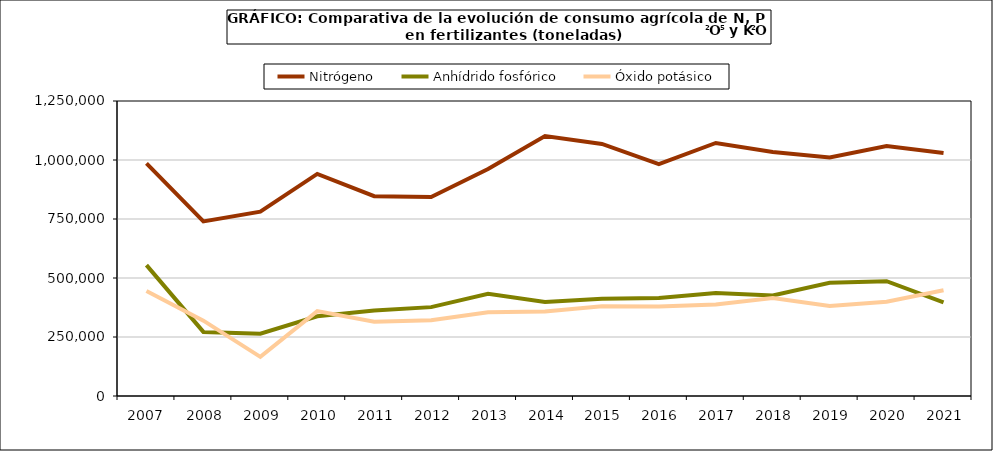
| Category | Nitrógeno | Anhídrido fosfórico | Óxido potásico |
|---|---|---|---|
|   2007  | 985857 | 554382 | 444853 |
|   2008 | 739757 | 271578 | 319194 |
|   2009 | 781069 | 264211 | 166016 |
|   2010 | 940984 | 337812 | 359583 |
|   2011 | 846697 | 362672 | 314642 |
|   2012 | 843410 | 376590 | 320841 |
|   2013 | 961507 | 432904 | 354738 |
|   2014 | 1101895 | 398580 | 357875 |
|   2015 | 1068103 | 411763 | 380303 |
|   2016 | 982155 | 414974 | 379007 |
|   2017 | 1072125 | 436110 | 387885 |
|   2018 | 1033494 | 425960 | 414675 |
|   2019 | 1010578 | 479562 | 381566 |
|   2020 | 1059299 | 486618 | 399379 |
|   2021 | 1029913 | 396291 | 447846 |